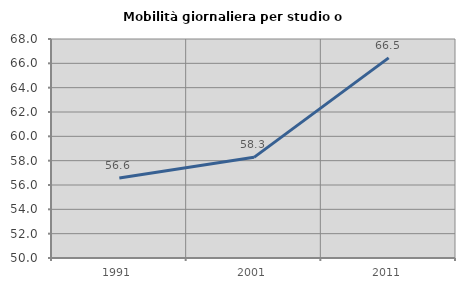
| Category | Mobilità giornaliera per studio o lavoro |
|---|---|
| 1991.0 | 56.579 |
| 2001.0 | 58.273 |
| 2011.0 | 66.452 |